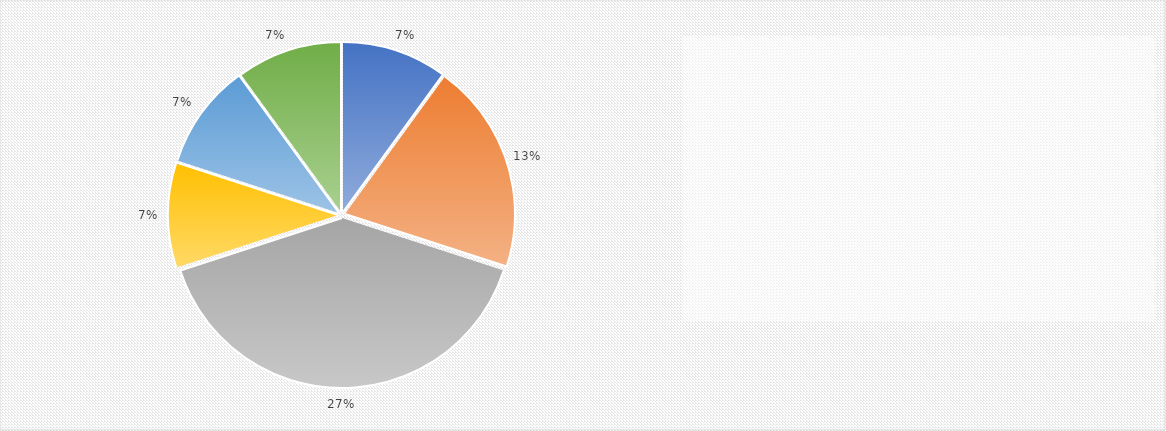
| Category | Series 0 |
|---|---|
| Pollution of waterways – with plastics and non-biodegradable material   | 0.067 |
| Predators – other predator birds competing for limited food  | 0.133 |
| Removal of their habitat due to human activities   | 0.267 |
| Collision with power lines and wind turbines    | 0.067 |
| Pesticides and heavy metals – enter the food chain and kill very young osprey   | 0.067 |
| Hunting, trapping and egg collection by humans  | 0.067 |